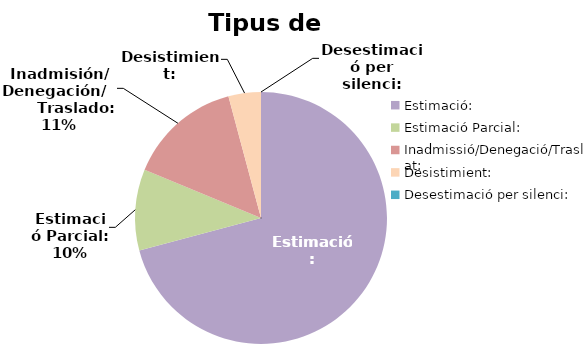
| Category | Tipus de resolució |
|---|---|
| Estimació: | 34 |
| Estimació Parcial: | 5 |
| Inadmissió/Denegació/Trasllat: | 7 |
| Desistimient: | 2 |
| Desestimació per silenci: | 0 |